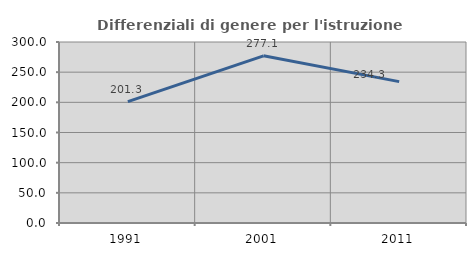
| Category | Differenziali di genere per l'istruzione superiore |
|---|---|
| 1991.0 | 201.269 |
| 2001.0 | 277.056 |
| 2011.0 | 234.343 |